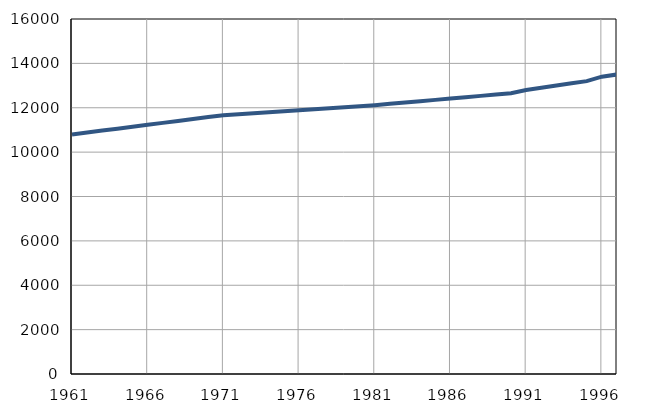
| Category | Population
size |
|---|---|
| 1961.0 | 10797 |
| 1962.0 | 10884 |
| 1963.0 | 10971 |
| 1964.0 | 11058 |
| 1965.0 | 11145 |
| 1966.0 | 11232 |
| 1967.0 | 11319 |
| 1968.0 | 11406 |
| 1969.0 | 11493 |
| 1970.0 | 11580 |
| 1971.0 | 11664 |
| 1972.0 | 11709 |
| 1973.0 | 11754 |
| 1974.0 | 11799 |
| 1975.0 | 11844 |
| 1976.0 | 11889 |
| 1977.0 | 11934 |
| 1978.0 | 11979 |
| 1979.0 | 12024 |
| 1980.0 | 12069 |
| 1981.0 | 12115 |
| 1982.0 | 12175 |
| 1983.0 | 12235 |
| 1984.0 | 12295 |
| 1985.0 | 12355 |
| 1986.0 | 12415 |
| 1987.0 | 12475 |
| 1988.0 | 12535 |
| 1989.0 | 12595 |
| 1990.0 | 12655 |
| 1991.0 | 12800 |
| 1992.0 | 12900 |
| 1993.0 | 13000 |
| 1994.0 | 13100 |
| 1995.0 | 13200 |
| 1996.0 | 13400 |
| 1997.0 | 13500 |